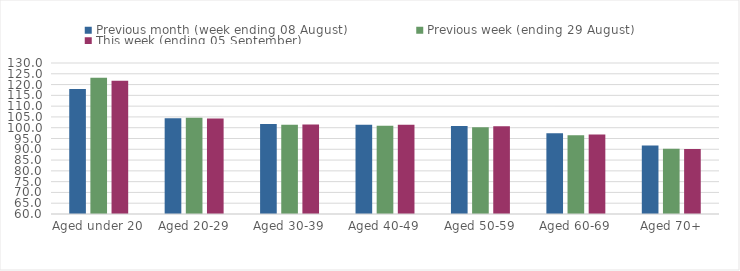
| Category | Previous month (week ending 08 August) | Previous week (ending 29 August) | This week (ending 05 September) |
|---|---|---|---|
| Aged under 20 | 117.99 | 123.18 | 121.81 |
| Aged 20-29 | 104.34 | 104.67 | 104.25 |
| Aged 30-39 | 101.74 | 101.39 | 101.49 |
| Aged 40-49 | 101.32 | 100.9 | 101.35 |
| Aged 50-59 | 100.8 | 100.21 | 100.73 |
| Aged 60-69 | 97.44 | 96.47 | 96.83 |
| Aged 70+ | 91.79 | 90.29 | 90.08 |